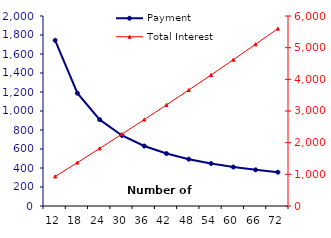
| Category | Payment |
|---|---|
| 12.0 | 1744.4 |
| 18.0 | 1187.37 |
| 24.0 | 909.11 |
| 30.0 | 742.36 |
| 36.0 | 631.35 |
| 42.0 | 552.2 |
| 48.0 | 492.97 |
| 54.0 | 447 |
| 60.0 | 410.33 |
| 66.0 | 380.42 |
| 72.0 | 355.57 |